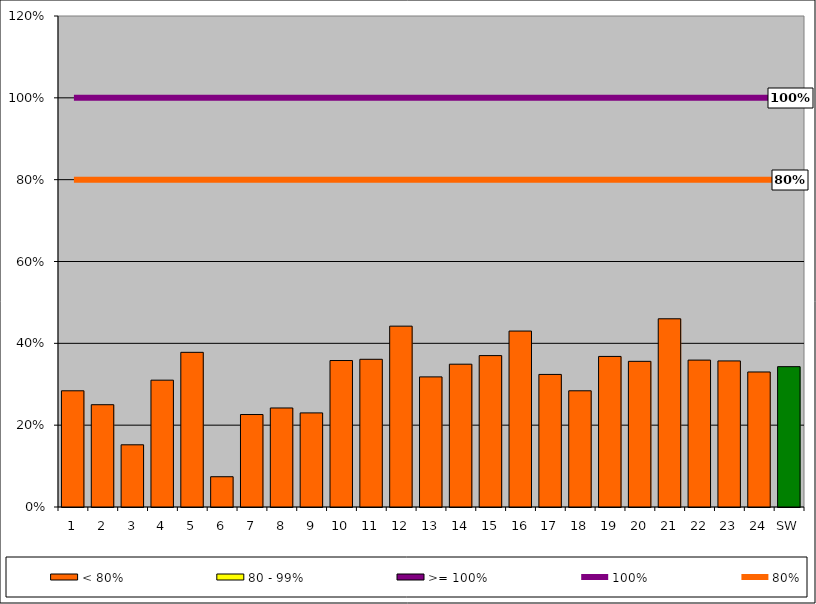
| Category | < 80% | 80 - 99% | >= 100% |
|---|---|---|---|
| 1 | 0.284 | 0 | 0 |
| 2 | 0.25 | 0 | 0 |
| 3 | 0.152 | 0 | 0 |
| 4 | 0.31 | 0 | 0 |
| 5 | 0.378 | 0 | 0 |
| 6 | 0.074 | 0 | 0 |
| 7 | 0.226 | 0 | 0 |
| 8 | 0.242 | 0 | 0 |
| 9 | 0.23 | 0 | 0 |
| 10 | 0.358 | 0 | 0 |
| 11 | 0.361 | 0 | 0 |
| 12 | 0.442 | 0 | 0 |
| 13 | 0.318 | 0 | 0 |
| 14 | 0.349 | 0 | 0 |
| 15 | 0.37 | 0 | 0 |
| 16 | 0.43 | 0 | 0 |
| 17 | 0.324 | 0 | 0 |
| 18 | 0.284 | 0 | 0 |
| 19 | 0.368 | 0 | 0 |
| 20 | 0.356 | 0 | 0 |
| 21 | 0.46 | 0 | 0 |
| 22 | 0.359 | 0 | 0 |
| 23 | 0.357 | 0 | 0 |
| 24 | 0.33 | 0 | 0 |
| SW | 0.343 | 0 | 0 |